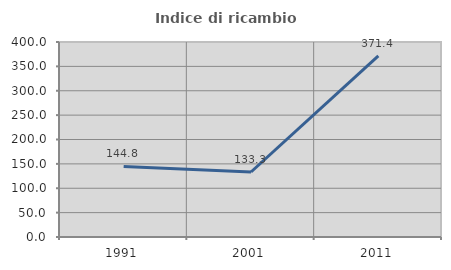
| Category | Indice di ricambio occupazionale  |
|---|---|
| 1991.0 | 144.828 |
| 2001.0 | 133.333 |
| 2011.0 | 371.429 |